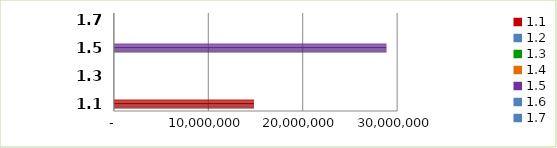
| Category | Series 0 |
|---|---|
| 1.1 | 14836499 |
| 1.2 | 0 |
| 1.3 | 0 |
| 1.4 | 0 |
| 1.5 | 28875001 |
| 1.6 | 0 |
| 1.7 | 0 |